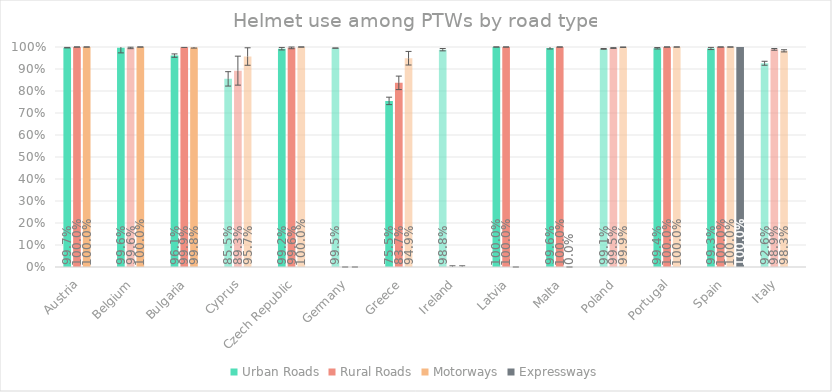
| Category | Urban Roads | Rural Roads | Motorways | Expressways |
|---|---|---|---|---|
| Austria | 0.997 | 1 | 1 | 0 |
| Belgium | 0.996 | 0.996 | 1 | 0 |
| Bulgaria | 0.961 | 0.999 | 0.998 | 0 |
| Cyprus | 0.855 | 0.893 | 0.957 | 0 |
| Czech Republic | 0.992 | 0.996 | 1 | 0 |
| Germany | 0.995 | 0 | 0 | 0 |
| Greece | 0.755 | 0.837 | 0.949 | 0 |
| Ireland | 0.988 | 0 | 0 | 0 |
| Latvia | 1 | 1 | 0 | 0 |
| Malta | 0.996 | 1 | 0 | 0 |
| Poland | 0.991 | 0.995 | 0.999 | 0 |
| Portugal | 0.994 | 1 | 1 | 0 |
| Spain | 0.993 | 1 | 1 | 1 |
| Italy | 0.926 | 0.989 | 0.983 | 0 |